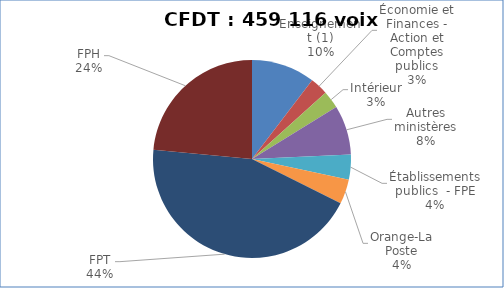
| Category | Nombre de voix |
|---|---|
| Enseignement (1) | 47704 |
| Économie et Finances - Action et Comptes publics | 13444.55 |
| Intérieur | 13189 |
| Autres ministères | 37139.5 |
| Établissements publics  - FPE | 18663.5 |
| Orange-La Poste | 18504.9 |
| FPT | 202618 |
| FPH | 107852.5 |